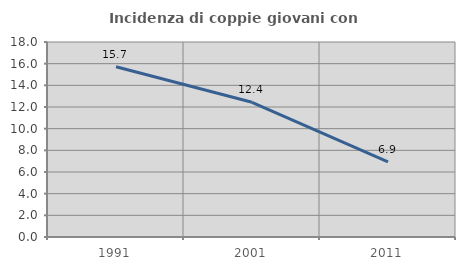
| Category | Incidenza di coppie giovani con figli |
|---|---|
| 1991.0 | 15.717 |
| 2001.0 | 12.434 |
| 2011.0 | 6.924 |